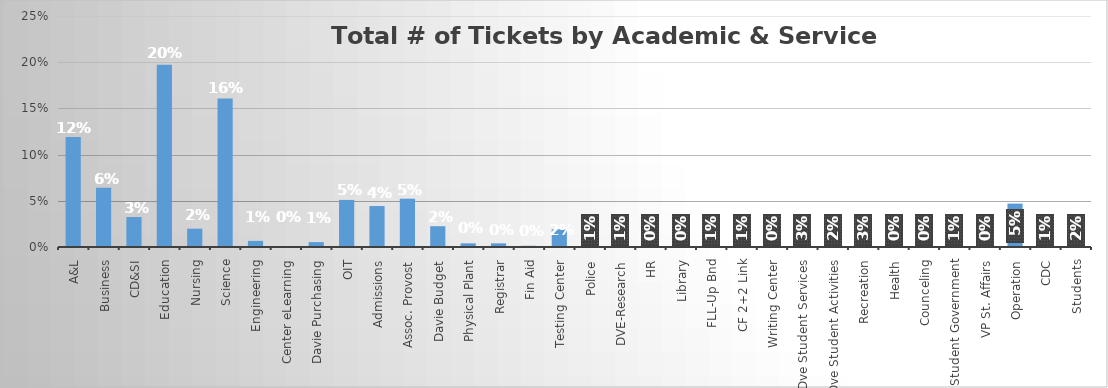
| Category | Series 0 |
|---|---|
| A&L | 0.119 |
| Business | 0.064 |
| CD&SI | 0.032 |
| Education | 0.197 |
| Nursing | 0.02 |
| Science | 0.161 |
| Engineering | 0.007 |
| Center eLearning | 0.001 |
| Davie Purchasing | 0.005 |
| OIT | 0.051 |
| Admissions | 0.044 |
| Assoc. Provost | 0.052 |
| Davie Budget | 0.023 |
| Physical Plant | 0.004 |
| Registrar | 0.004 |
| Fin Aid | 0.001 |
| Testing Center | 0.019 |
| Police | 0.007 |
| DVE-Research | 0.011 |
| HR | 0.003 |
| Library | 0 |
| FLL-Up Bnd | 0.006 |
| CF 2+2 Link | 0.006 |
| Writing Center | 0.002 |
| Dve Student Services | 0.029 |
| Dve Student Activities | 0.018 |
| Recreation | 0.028 |
| Health | 0.001 |
| Counceling | 0.002 |
| Student Government | 0.007 |
| VP St. Affairs | 0.003 |
| Operation | 0.047 |
| CDC | 0.011 |
| Students | 0.017 |